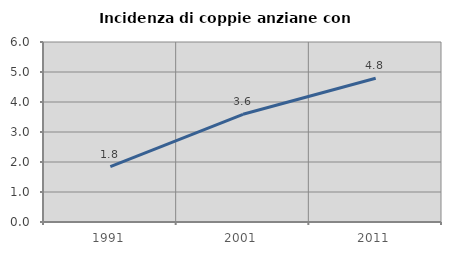
| Category | Incidenza di coppie anziane con figli |
|---|---|
| 1991.0 | 1.845 |
| 2001.0 | 3.59 |
| 2011.0 | 4.793 |